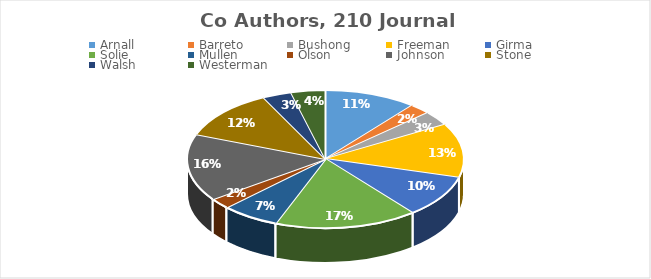
| Category | Series 0 |
|---|---|
| Arnall | 35 |
| Barreto | 8 |
| Bushong | 11 |
| Freeman | 41 |
| Girma | 32 |
| Solie | 54 |
| Mullen | 22 |
| Olson | 8 |
| Johnson  | 51 |
| Stone  | 38 |
| Walsh | 11 |
| Westerman | 13 |